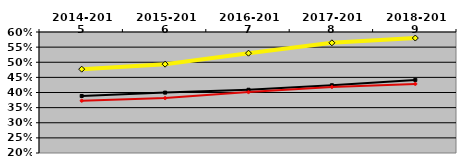
| Category | NATIONAL MEDIAN | WEST MEDIAN | TEXAS LUTHERAN |
|---|---|---|---|
| 2014-2015 | 0.389 | 0.373 | 0.477 |
| 2015-2016 | 0.4 | 0.382 | 0.494 |
| 2016-2017 | 0.409 | 0.401 | 0.53 |
| 2017-2018 | 0.424 | 0.418 | 0.564 |
| 2018-2019 | 0.442 | 0.428 | 0.58 |